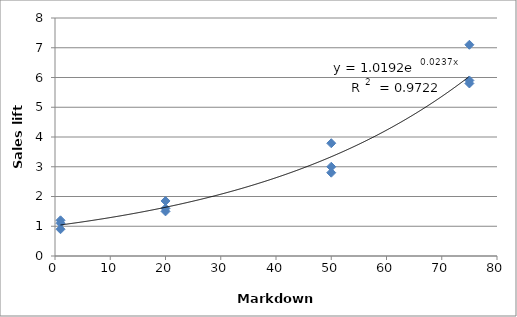
| Category | Series 0 |
|---|---|
| 1.0 | 1.1 |
| 1.0 | 1.2 |
| 1.0 | 0.9 |
| 20.0 | 1.85 |
| 20.0 | 1.5 |
| 20.0 | 1.6 |
| 50.0 | 3.79 |
| 50.0 | 3 |
| 50.0 | 2.8 |
| 75.0 | 5.9 |
| 75.0 | 5.8 |
| 75.0 | 7.1 |